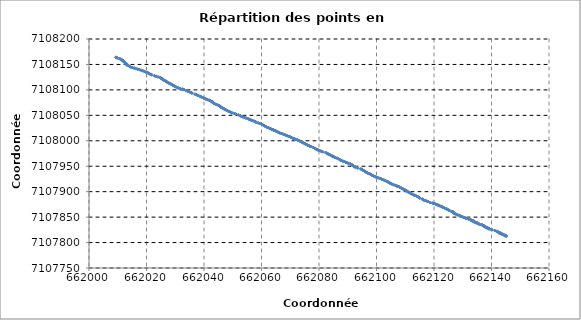
| Category | Series 0 |
|---|---|
| 662145.111 | 7107812.6 |
| 662145.042 | 7107812.792 |
| 662144.773 | 7107813.51 |
| 662144.778999999 | 7107814.098 |
| 662144.418999999 | 7107814.674 |
| 662144.224999999 | 7107815.118 |
| 662144.125 | 7107815.641 |
| 662143.934 | 7107815.926 |
| 662143.65 | 7107816.684 |
| 662143.501 | 7107817.212 |
| 662143.386999999 | 7107817.545 |
| 662143.155 | 7107818.108 |
| 662142.934 | 7107818.808 |
| 662142.679 | 7107818.835 |
| 662142.895 | 7107819.417 |
| 662142.283999999 | 7107820.616 |
| 662141.905 | 7107822.142 |
| 662141.184 | 7107823.402 |
| 662140.138 | 7107825.047 |
| 662139.92 | 7107825.675 |
| 662139.201 | 7107826.834 |
| 662139.054 | 7107827.256 |
| 662138.917999999 | 7107827.654 |
| 662138.842999999 | 7107828.077 |
| 662138.618999999 | 7107828.518 |
| 662138.437 | 7107828.947 |
| 662138.361 | 7107829.491 |
| 662138.314 | 7107829.88 |
| 662137.945999999 | 7107830.435 |
| 662137.729 | 7107831.118 |
| 662137.650999999 | 7107831.622 |
| 662137.442999999 | 7107832.231 |
| 662137.359999999 | 7107832.711 |
| 662137.212 | 7107833.304 |
| 662136.932 | 7107833.925 |
| 662136.743999999 | 7107834.581 |
| 662136.444 | 7107835.412 |
| 662135.704 | 7107836.015 |
| 662135.467999999 | 7107837.203 |
| 662135.297999999 | 7107837.484 |
| 662135.163999999 | 7107837.857 |
| 662135.067999999 | 7107838.073 |
| 662134.949999999 | 7107838.621 |
| 662134.633999999 | 7107839.371 |
| 662134.18 | 7107840.087 |
| 662134.025 | 7107840.609 |
| 662133.991999999 | 7107840.942 |
| 662133.913999999 | 7107841.684 |
| 662133.778 | 7107842.072 |
| 662133.520999999 | 7107842.371 |
| 662133.464 | 7107842.485 |
| 662133.388 | 7107842.875 |
| 662133.393999999 | 7107842.879 |
| 662133.187999999 | 7107843.216 |
| 662132.893 | 7107844.273 |
| 662132.697999999 | 7107844.573 |
| 662131.944 | 7107846.202 |
| 662131.386 | 7107847.185 |
| 662130.930999999 | 7107848.232 |
| 662130.440999999 | 7107849.303 |
| 662130.011999999 | 7107850.239 |
| 662129.53 | 7107851.333 |
| 662129.201 | 7107852.358 |
| 662128.711 | 7107853.416 |
| 662128.211 | 7107854.456 |
| 662127.758999999 | 7107855.437 |
| 662127.356 | 7107856.422 |
| 662126.871 | 7107857.69 |
| 662126.694999999 | 7107858.852 |
| 662126.525999999 | 7107859.968 |
| 662126.542999999 | 7107860.633 |
| 662126.037 | 7107861.281 |
| 662125.258999999 | 7107863.323 |
| 662124.969 | 7107864.329 |
| 662124.545999999 | 7107865.517 |
| 662124.118 | 7107866.869 |
| 662123.643999999 | 7107867.9 |
| 662123.094999999 | 7107869.169 |
| 662122.829 | 7107870.192 |
| 662122.471999999 | 7107871.144 |
| 662121.940999999 | 7107872.304 |
| 662121.523 | 7107873.153 |
| 662121.486999999 | 7107873.432 |
| 662121.05 | 7107874.49 |
| 662120.564999999 | 7107875.558 |
| 662120.038999999 | 7107876.591 |
| 662119.462999999 | 7107877.566 |
| 662118.663999999 | 7107878.77 |
| 662117.876 | 7107880.692 |
| 662117.317999999 | 7107881.747 |
| 662116.871 | 7107882.751 |
| 662116.322 | 7107883.608 |
| 662116.143 | 7107884.69 |
| 662115.868999999 | 7107885.778 |
| 662114.981999999 | 7107887.434 |
| 662114.542999999 | 7107889.402 |
| 662113.957 | 7107891.241 |
| 662113.231999999 | 7107892.815 |
| 662113.182 | 7107892.947 |
| 662112.484999999 | 7107894.869 |
| 662112.089999999 | 7107895.93 |
| 662111.739999999 | 7107896.962 |
| 662111.224999999 | 7107898.852 |
| 662110.836 | 7107899.968 |
| 662110.589 | 7107901.115 |
| 662110.265999999 | 7107902.189 |
| 662109.944999999 | 7107903.244 |
| 662109.481 | 7107904.544 |
| 662109.145 | 7107905.598 |
| 662108.714 | 7107906.804 |
| 662108.361 | 7107907.978 |
| 662107.972999999 | 7107908.99 |
| 662107.628 | 7107910.138 |
| 662107.347999999 | 7107910.658 |
| 662107.082 | 7107911.17 |
| 662106.523 | 7107912.317 |
| 662105.947 | 7107913.703 |
| 662105.347999999 | 7107914.916 |
| 662104.959999999 | 7107915.986 |
| 662104.662 | 7107917.017 |
| 662104.266999999 | 7107918.08 |
| 662103.993999999 | 7107919.249 |
| 662103.572999999 | 7107920.336 |
| 662103.087999999 | 7107921.532 |
| 662102.601999999 | 7107922.719 |
| 662102.082 | 7107923.922 |
| 662101.716999999 | 7107924.989 |
| 662101.133999999 | 7107926.184 |
| 662100.564999999 | 7107927.124 |
| 662100.074 | 7107928.278 |
| 662099.579999999 | 7107929.32 |
| 662099.074999999 | 7107930.593 |
| 662098.670999999 | 7107931.708 |
| 662098.317999999 | 7107932.983 |
| 662097.986999999 | 7107934.171 |
| 662097.54 | 7107935.266 |
| 662096.976999999 | 7107936.462 |
| 662096.609 | 7107937.833 |
| 662096.248999999 | 7107938.902 |
| 662095.902 | 7107940.129 |
| 662095.494999999 | 7107941.635 |
| 662095.143 | 7107942.624 |
| 662094.893 | 7107943.798 |
| 662094.545 | 7107944.804 |
| 662093.483 | 7107946.459 |
| 662092.641999999 | 7107948.314 |
| 662092.491999999 | 7107948.697 |
| 662092.256999999 | 7107949.297 |
| 662091.940999999 | 7107950.648 |
| 662091.690999999 | 7107951.978 |
| 662091.417999999 | 7107953.116 |
| 662090.912999999 | 7107954.412 |
| 662090.283999999 | 7107955.651 |
| 662089.797999999 | 7107956.727 |
| 662089.280999999 | 7107957.85 |
| 662088.716 | 7107959.104 |
| 662088.248999999 | 7107960.179 |
| 662087.722999999 | 7107961.302 |
| 662087.337 | 7107962.609 |
| 662086.787999999 | 7107964.575 |
| 662086.29 | 7107965.79 |
| 662085.675999999 | 7107966.881 |
| 662085.292 | 7107967.943 |
| 662084.929 | 7107969.022 |
| 662084.697999999 | 7107969.78 |
| 662084.530999999 | 7107970.179 |
| 662083.876 | 7107972.194 |
| 662083.437 | 7107973.298 |
| 662083.114999999 | 7107974.273 |
| 662082.741 | 7107975.554 |
| 662082.339 | 7107976.751 |
| 662081.29 | 7107978.5 |
| 662080.736 | 7107979.469 |
| 662080.261999999 | 7107980.636 |
| 662079.729 | 7107981.587 |
| 662079.366999999 | 7107982.607 |
| 662078.967999999 | 7107983.748 |
| 662078.599 | 7107984.842 |
| 662078.013 | 7107986.748 |
| 662077.332 | 7107988.504 |
| 662076.787999999 | 7107989.485 |
| 662076.393999999 | 7107990.693 |
| 662075.952999999 | 7107991.646 |
| 662075.569 | 7107992.803 |
| 662075.231 | 7107993.926 |
| 662074.805 | 7107995.09 |
| 662074.395999999 | 7107996.304 |
| 662074.037999999 | 7107997.4 |
| 662073.648 | 7107998.502 |
| 662073.312 | 7107999.688 |
| 662072.839 | 7108000.758 |
| 662072.466999999 | 7108001.774 |
| 662071.935 | 7108002.803 |
| 662071.537999999 | 7108003.543 |
| 662071.418999999 | 7108003.764 |
| 662070.907 | 7108004.995 |
| 662070.393999999 | 7108006.241 |
| 662070.065999999 | 7108007.526 |
| 662069.548999999 | 7108008.617 |
| 662069.02 | 7108009.762 |
| 662068.440999999 | 7108010.962 |
| 662067.962 | 7108012.055 |
| 662067.469999999 | 7108013.227 |
| 662066.903999999 | 7108014.308 |
| 662066.315999999 | 7108015.492 |
| 662065.888 | 7108016.705 |
| 662065.503999999 | 7108017.783 |
| 662065.079999999 | 7108018.967 |
| 662064.689999999 | 7108019.993 |
| 662064.256999999 | 7108020.944 |
| 662064.101999999 | 7108021.283 |
| 662063.721 | 7108022.111 |
| 662063.277 | 7108023.475 |
| 662062.778 | 7108024.537 |
| 662062.302 | 7108025.86 |
| 662061.770999999 | 7108026.903 |
| 662061.417999999 | 7108028.167 |
| 662061.052999999 | 7108029.351 |
| 662060.721 | 7108030.404 |
| 662060.29 | 7108031.798 |
| 662059.959 | 7108032.934 |
| 662059.410999999 | 7108034.014 |
| 662058.851999999 | 7108035.205 |
| 662058.101999999 | 7108036.309 |
| 662057.881999999 | 7108037.331 |
| 662057.484 | 7108038.388 |
| 662056.988 | 7108039.438 |
| 662056.452 | 7108040.422 |
| 662056.025 | 7108041.397 |
| 662055.626999999 | 7108042.386 |
| 662055.180999999 | 7108043.608 |
| 662054.577 | 7108044.607 |
| 662054.04 | 7108045.672 |
| 662053.511 | 7108046.932 |
| 662053.091999999 | 7108047.88 |
| 662052.699 | 7108048.962 |
| 662051.898999999 | 7108050.968 |
| 662051.008 | 7108052.554 |
| 662050.562999999 | 7108053.528 |
| 662049.712 | 7108054.97 |
| 662049.572 | 7108055.239 |
| 662049.146999999 | 7108056.372 |
| 662048.677 | 7108057.727 |
| 662048.192999999 | 7108058.97 |
| 662047.748999999 | 7108060.125 |
| 662047.353 | 7108061.397 |
| 662047.037999999 | 7108062.465 |
| 662046.677 | 7108063.621 |
| 662046.285999999 | 7108064.887 |
| 662045.881999999 | 7108066.122 |
| 662045.574999999 | 7108067.267 |
| 662045.439 | 7108068.455 |
| 662045.048999999 | 7108069.567 |
| 662044.557 | 7108070.707 |
| 662044.050999999 | 7108071.918 |
| 662043.570999999 | 7108073.056 |
| 662043.314 | 7108074.132 |
| 662043.033999999 | 7108075.247 |
| 662042.9 | 7108076.35 |
| 662042.618 | 7108077.423 |
| 662042.243999999 | 7108078.5 |
| 662041.765999999 | 7108079.622 |
| 662041.253999999 | 7108080.742 |
| 662040.731 | 7108081.749 |
| 662040.329999999 | 7108082.984 |
| 662039.917 | 7108083.982 |
| 662039.444999999 | 7108085.158 |
| 662039.013 | 7108086.35 |
| 662038.596 | 7108087.494 |
| 662037.886 | 7108088.96 |
| 662037.878 | 7108089.102 |
| 662037.346 | 7108090.533 |
| 662036.881 | 7108091.725 |
| 662035.787 | 7108093.565 |
| 662035.547999999 | 7108095.007 |
| 662034.89 | 7108096.088 |
| 662034.435999999 | 7108097.244 |
| 662033.876 | 7108098.505 |
| 662033.094999999 | 7108100.438 |
| 662032.548999999 | 7108101.586 |
| 662031.814 | 7108102.345 |
| 662031.287 | 7108103.307 |
| 662030.875 | 7108104.276 |
| 662030.315999999 | 7108105.448 |
| 662029.978 | 7108106.602 |
| 662029.633 | 7108107.722 |
| 662029.234999999 | 7108108.934 |
| 662029.028 | 7108109.954 |
| 662028.542999999 | 7108111.156 |
| 662028.148999999 | 7108112.288 |
| 662027.771999999 | 7108113.356 |
| 662027.451 | 7108114.505 |
| 662027.097999999 | 7108115.583 |
| 662026.831 | 7108116.757 |
| 662026.471 | 7108117.868 |
| 662026.092999999 | 7108119.061 |
| 662025.775 | 7108120.165 |
| 662025.462 | 7108121.206 |
| 662025.229999999 | 7108122.283 |
| 662025.045 | 7108123.326 |
| 662024.63 | 7108124.566 |
| 662023.976999999 | 7108125.541 |
| 662023.320999999 | 7108126.591 |
| 662022.815999999 | 7108127.609 |
| 662021.822 | 7108129.551 |
| 662021.371999999 | 7108130.61 |
| 662020.988 | 7108131.695 |
| 662020.596999999 | 7108132.87 |
| 662020.364999999 | 7108133.966 |
| 662019.670999999 | 7108135.198 |
| 662019.256999999 | 7108136.381 |
| 662018.734999999 | 7108137.457 |
| 662018.158999999 | 7108138.526 |
| 662017.574 | 7108139.63 |
| 662016.912 | 7108140.71 |
| 662016.31 | 7108141.813 |
| 662015.694 | 7108142.861 |
| 662015.091999999 | 7108143.746 |
| 662014.537 | 7108144.875 |
| 662014.121999999 | 7108146.119 |
| 662013.604 | 7108148.153 |
| 662013.207 | 7108149.095 |
| 662012.947 | 7108150.436 |
| 662012.886999999 | 7108150.804 |
| 662012.746 | 7108151.832 |
| 662012.581 | 7108153.124 |
| 662012.337 | 7108154.68 |
| 662012.069999999 | 7108155.91 |
| 662011.824 | 7108156.984 |
| 662011.665 | 7108158.086 |
| 662011.402 | 7108159.063 |
| 662010.976 | 7108160.362 |
| 662010.621999999 | 7108161.31 |
| 662009.814999999 | 7108162.876 |
| 662009.481 | 7108163.265 |
| 662009.402 | 7108164.077 |